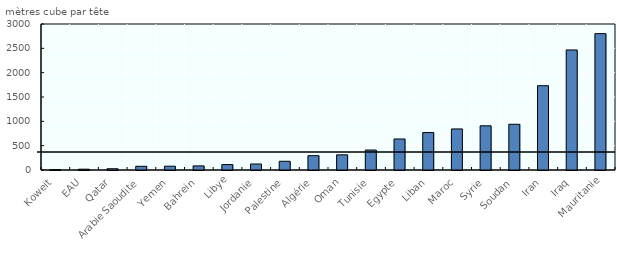
| Category | Ressources aquifères renouvelables par personne |
|---|---|
| Koweit | 5.139 |
| EAU | 16.38 |
| Qatar | 25.95 |
| Arabie Saoudite | 76.09 |
| Yemen | 78.26 |
| Bahrein | 84.24 |
| Libye | 111.5 |
| Jordanie | 123.4 |
| Palestine | 179.3 |
| Algérie | 294.2 |
| Oman | 311.7 |
| Tunisie | 410.1 |
| Egypte | 637.1 |
| Liban | 769.6 |
| Maroc | 843.6 |
| Syrie | 908 |
| Soudan | 939.5 |
| Iran | 1732 |
| Iraq | 2467 |
| Mauritanie | 2802 |